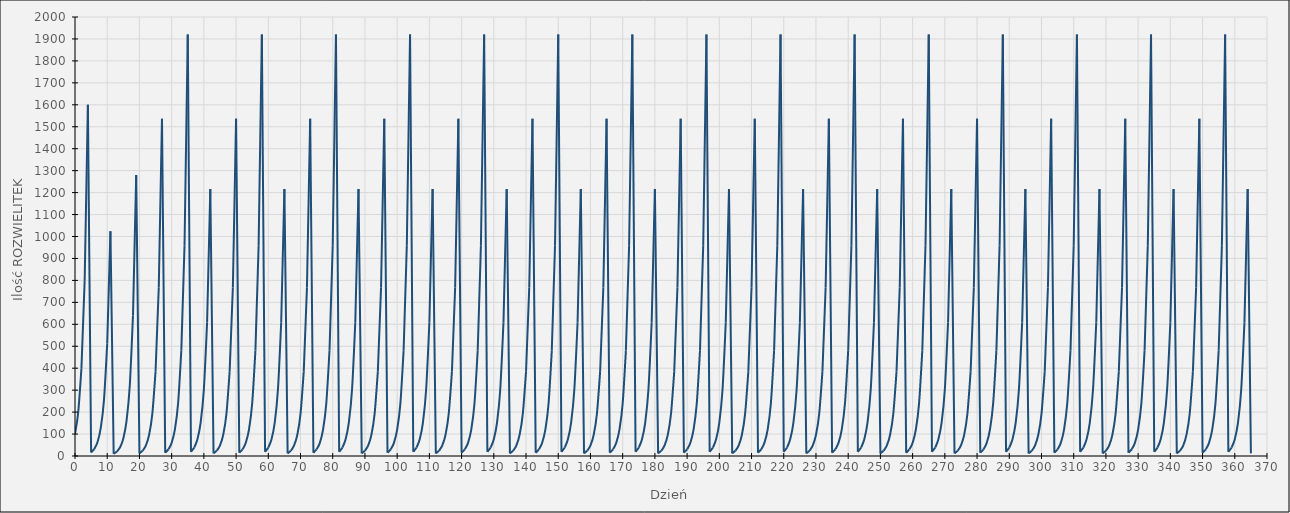
| Category | liczba rozwielitek |
|---|---|
| 0.0 | 100 |
| 1.0 | 200 |
| 2.0 | 400 |
| 3.0 | 800 |
| 4.0 | 1600 |
| 5.0 | 16 |
| 6.0 | 32 |
| 7.0 | 64 |
| 8.0 | 128 |
| 9.0 | 256 |
| 10.0 | 512 |
| 11.0 | 1024 |
| 12.0 | 10 |
| 13.0 | 20 |
| 14.0 | 40 |
| 15.0 | 80 |
| 16.0 | 160 |
| 17.0 | 320 |
| 18.0 | 640 |
| 19.0 | 1280 |
| 20.0 | 12 |
| 21.0 | 24 |
| 22.0 | 48 |
| 23.0 | 96 |
| 24.0 | 192 |
| 25.0 | 384 |
| 26.0 | 768 |
| 27.0 | 1536 |
| 28.0 | 15 |
| 29.0 | 30 |
| 30.0 | 60 |
| 31.0 | 120 |
| 32.0 | 240 |
| 33.0 | 480 |
| 34.0 | 960 |
| 35.0 | 1920 |
| 36.0 | 19 |
| 37.0 | 38 |
| 38.0 | 76 |
| 39.0 | 152 |
| 40.0 | 304 |
| 41.0 | 608 |
| 42.0 | 1216 |
| 43.0 | 12 |
| 44.0 | 24 |
| 45.0 | 48 |
| 46.0 | 96 |
| 47.0 | 192 |
| 48.0 | 384 |
| 49.0 | 768 |
| 50.0 | 1536 |
| 51.0 | 15 |
| 52.0 | 30 |
| 53.0 | 60 |
| 54.0 | 120 |
| 55.0 | 240 |
| 56.0 | 480 |
| 57.0 | 960 |
| 58.0 | 1920 |
| 59.0 | 19 |
| 60.0 | 38 |
| 61.0 | 76 |
| 62.0 | 152 |
| 63.0 | 304 |
| 64.0 | 608 |
| 65.0 | 1216 |
| 66.0 | 12 |
| 67.0 | 24 |
| 68.0 | 48 |
| 69.0 | 96 |
| 70.0 | 192 |
| 71.0 | 384 |
| 72.0 | 768 |
| 73.0 | 1536 |
| 74.0 | 15 |
| 75.0 | 30 |
| 76.0 | 60 |
| 77.0 | 120 |
| 78.0 | 240 |
| 79.0 | 480 |
| 80.0 | 960 |
| 81.0 | 1920 |
| 82.0 | 19 |
| 83.0 | 38 |
| 84.0 | 76 |
| 85.0 | 152 |
| 86.0 | 304 |
| 87.0 | 608 |
| 88.0 | 1216 |
| 89.0 | 12 |
| 90.0 | 24 |
| 91.0 | 48 |
| 92.0 | 96 |
| 93.0 | 192 |
| 94.0 | 384 |
| 95.0 | 768 |
| 96.0 | 1536 |
| 97.0 | 15 |
| 98.0 | 30 |
| 99.0 | 60 |
| 100.0 | 120 |
| 101.0 | 240 |
| 102.0 | 480 |
| 103.0 | 960 |
| 104.0 | 1920 |
| 105.0 | 19 |
| 106.0 | 38 |
| 107.0 | 76 |
| 108.0 | 152 |
| 109.0 | 304 |
| 110.0 | 608 |
| 111.0 | 1216 |
| 112.0 | 12 |
| 113.0 | 24 |
| 114.0 | 48 |
| 115.0 | 96 |
| 116.0 | 192 |
| 117.0 | 384 |
| 118.0 | 768 |
| 119.0 | 1536 |
| 120.0 | 15 |
| 121.0 | 30 |
| 122.0 | 60 |
| 123.0 | 120 |
| 124.0 | 240 |
| 125.0 | 480 |
| 126.0 | 960 |
| 127.0 | 1920 |
| 128.0 | 19 |
| 129.0 | 38 |
| 130.0 | 76 |
| 131.0 | 152 |
| 132.0 | 304 |
| 133.0 | 608 |
| 134.0 | 1216 |
| 135.0 | 12 |
| 136.0 | 24 |
| 137.0 | 48 |
| 138.0 | 96 |
| 139.0 | 192 |
| 140.0 | 384 |
| 141.0 | 768 |
| 142.0 | 1536 |
| 143.0 | 15 |
| 144.0 | 30 |
| 145.0 | 60 |
| 146.0 | 120 |
| 147.0 | 240 |
| 148.0 | 480 |
| 149.0 | 960 |
| 150.0 | 1920 |
| 151.0 | 19 |
| 152.0 | 38 |
| 153.0 | 76 |
| 154.0 | 152 |
| 155.0 | 304 |
| 156.0 | 608 |
| 157.0 | 1216 |
| 158.0 | 12 |
| 159.0 | 24 |
| 160.0 | 48 |
| 161.0 | 96 |
| 162.0 | 192 |
| 163.0 | 384 |
| 164.0 | 768 |
| 165.0 | 1536 |
| 166.0 | 15 |
| 167.0 | 30 |
| 168.0 | 60 |
| 169.0 | 120 |
| 170.0 | 240 |
| 171.0 | 480 |
| 172.0 | 960 |
| 173.0 | 1920 |
| 174.0 | 19 |
| 175.0 | 38 |
| 176.0 | 76 |
| 177.0 | 152 |
| 178.0 | 304 |
| 179.0 | 608 |
| 180.0 | 1216 |
| 181.0 | 12 |
| 182.0 | 24 |
| 183.0 | 48 |
| 184.0 | 96 |
| 185.0 | 192 |
| 186.0 | 384 |
| 187.0 | 768 |
| 188.0 | 1536 |
| 189.0 | 15 |
| 190.0 | 30 |
| 191.0 | 60 |
| 192.0 | 120 |
| 193.0 | 240 |
| 194.0 | 480 |
| 195.0 | 960 |
| 196.0 | 1920 |
| 197.0 | 19 |
| 198.0 | 38 |
| 199.0 | 76 |
| 200.0 | 152 |
| 201.0 | 304 |
| 202.0 | 608 |
| 203.0 | 1216 |
| 204.0 | 12 |
| 205.0 | 24 |
| 206.0 | 48 |
| 207.0 | 96 |
| 208.0 | 192 |
| 209.0 | 384 |
| 210.0 | 768 |
| 211.0 | 1536 |
| 212.0 | 15 |
| 213.0 | 30 |
| 214.0 | 60 |
| 215.0 | 120 |
| 216.0 | 240 |
| 217.0 | 480 |
| 218.0 | 960 |
| 219.0 | 1920 |
| 220.0 | 19 |
| 221.0 | 38 |
| 222.0 | 76 |
| 223.0 | 152 |
| 224.0 | 304 |
| 225.0 | 608 |
| 226.0 | 1216 |
| 227.0 | 12 |
| 228.0 | 24 |
| 229.0 | 48 |
| 230.0 | 96 |
| 231.0 | 192 |
| 232.0 | 384 |
| 233.0 | 768 |
| 234.0 | 1536 |
| 235.0 | 15 |
| 236.0 | 30 |
| 237.0 | 60 |
| 238.0 | 120 |
| 239.0 | 240 |
| 240.0 | 480 |
| 241.0 | 960 |
| 242.0 | 1920 |
| 243.0 | 19 |
| 244.0 | 38 |
| 245.0 | 76 |
| 246.0 | 152 |
| 247.0 | 304 |
| 248.0 | 608 |
| 249.0 | 1216 |
| 250.0 | 12 |
| 251.0 | 24 |
| 252.0 | 48 |
| 253.0 | 96 |
| 254.0 | 192 |
| 255.0 | 384 |
| 256.0 | 768 |
| 257.0 | 1536 |
| 258.0 | 15 |
| 259.0 | 30 |
| 260.0 | 60 |
| 261.0 | 120 |
| 262.0 | 240 |
| 263.0 | 480 |
| 264.0 | 960 |
| 265.0 | 1920 |
| 266.0 | 19 |
| 267.0 | 38 |
| 268.0 | 76 |
| 269.0 | 152 |
| 270.0 | 304 |
| 271.0 | 608 |
| 272.0 | 1216 |
| 273.0 | 12 |
| 274.0 | 24 |
| 275.0 | 48 |
| 276.0 | 96 |
| 277.0 | 192 |
| 278.0 | 384 |
| 279.0 | 768 |
| 280.0 | 1536 |
| 281.0 | 15 |
| 282.0 | 30 |
| 283.0 | 60 |
| 284.0 | 120 |
| 285.0 | 240 |
| 286.0 | 480 |
| 287.0 | 960 |
| 288.0 | 1920 |
| 289.0 | 19 |
| 290.0 | 38 |
| 291.0 | 76 |
| 292.0 | 152 |
| 293.0 | 304 |
| 294.0 | 608 |
| 295.0 | 1216 |
| 296.0 | 12 |
| 297.0 | 24 |
| 298.0 | 48 |
| 299.0 | 96 |
| 300.0 | 192 |
| 301.0 | 384 |
| 302.0 | 768 |
| 303.0 | 1536 |
| 304.0 | 15 |
| 305.0 | 30 |
| 306.0 | 60 |
| 307.0 | 120 |
| 308.0 | 240 |
| 309.0 | 480 |
| 310.0 | 960 |
| 311.0 | 1920 |
| 312.0 | 19 |
| 313.0 | 38 |
| 314.0 | 76 |
| 315.0 | 152 |
| 316.0 | 304 |
| 317.0 | 608 |
| 318.0 | 1216 |
| 319.0 | 12 |
| 320.0 | 24 |
| 321.0 | 48 |
| 322.0 | 96 |
| 323.0 | 192 |
| 324.0 | 384 |
| 325.0 | 768 |
| 326.0 | 1536 |
| 327.0 | 15 |
| 328.0 | 30 |
| 329.0 | 60 |
| 330.0 | 120 |
| 331.0 | 240 |
| 332.0 | 480 |
| 333.0 | 960 |
| 334.0 | 1920 |
| 335.0 | 19 |
| 336.0 | 38 |
| 337.0 | 76 |
| 338.0 | 152 |
| 339.0 | 304 |
| 340.0 | 608 |
| 341.0 | 1216 |
| 342.0 | 12 |
| 343.0 | 24 |
| 344.0 | 48 |
| 345.0 | 96 |
| 346.0 | 192 |
| 347.0 | 384 |
| 348.0 | 768 |
| 349.0 | 1536 |
| 350.0 | 15 |
| 351.0 | 30 |
| 352.0 | 60 |
| 353.0 | 120 |
| 354.0 | 240 |
| 355.0 | 480 |
| 356.0 | 960 |
| 357.0 | 1920 |
| 358.0 | 19 |
| 359.0 | 38 |
| 360.0 | 76 |
| 361.0 | 152 |
| 362.0 | 304 |
| 363.0 | 608 |
| 364.0 | 1216 |
| 365.0 | 12 |